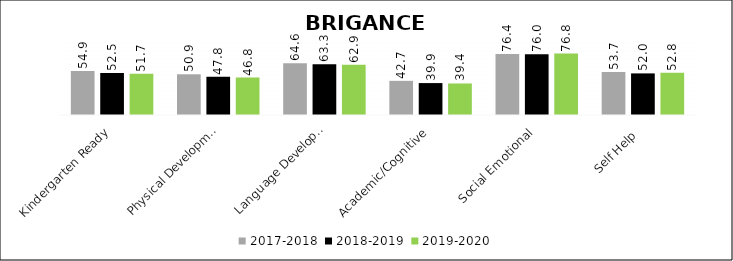
| Category | 2017-2018 | 2018-2019 | 2019-2020 |
|---|---|---|---|
| Kindergarten Ready | 54.9 | 52.5 | 51.7 |
| Physical Development | 50.9 | 47.8 | 46.8 |
| Language Development | 64.6 | 63.3 | 62.9 |
| Academic/Cognitive | 42.7 | 39.9 | 39.4 |
| Social Emotional | 76.4 | 76 | 76.8 |
| Self Help  | 53.7 | 52 | 52.8 |